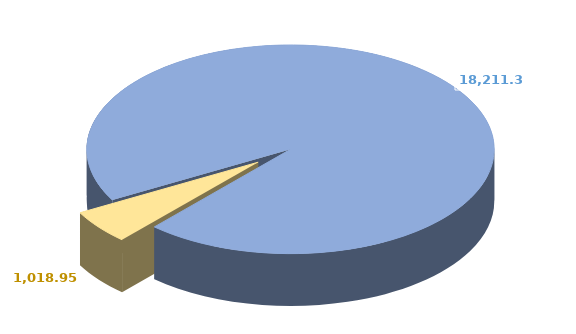
| Category | Series 0 |
|---|---|
| 0 | 18211.395 |
| 1 | 1018.949 |